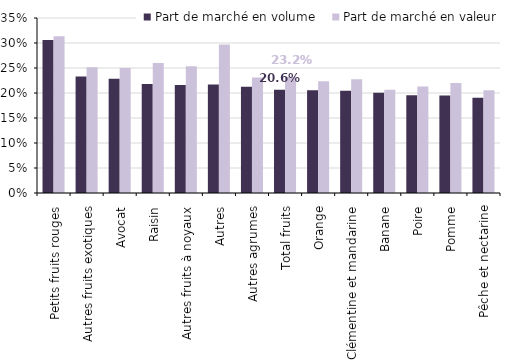
| Category | Part de marché en volume | Part de marché en valeur |
|---|---|---|
| Petits fruits rouges | 0.306 | 0.313 |
| Autres fruits exotiques | 0.233 | 0.252 |
| Avocat | 0.228 | 0.25 |
| Raisin | 0.218 | 0.26 |
| Autres fruits à noyaux | 0.216 | 0.254 |
| Autres | 0.217 | 0.297 |
| Autres agrumes | 0.212 | 0.231 |
| Total fruits | 0.206 | 0.232 |
| Orange | 0.206 | 0.224 |
| Clémentine et mandarine | 0.205 | 0.228 |
| Banane | 0.201 | 0.206 |
| Poire | 0.196 | 0.213 |
| Pomme | 0.195 | 0.22 |
| Pêche et nectarine | 0.191 | 0.206 |